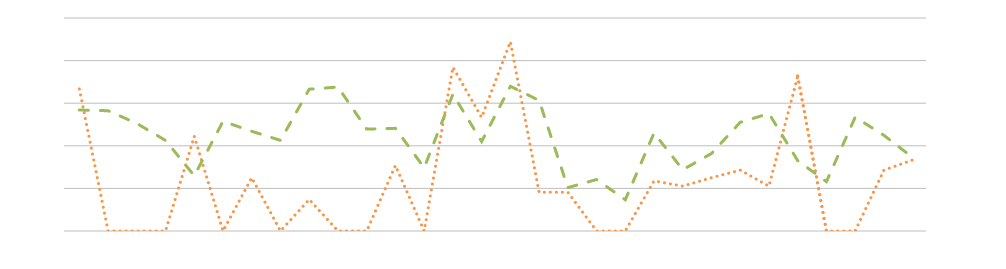
| Category | ctr |
|---|---|
| 2015-09-01 | 0.167 |
| 2015-09-02 | 0 |
| 2015-09-03 | 0 |
| 2015-09-04 | 0 |
| 2015-09-05 | 0.111 |
| 2015-09-06 | 0 |
| 2015-09-07 | 0.062 |
| 2015-09-08 | 0 |
| 2015-09-09 | 0.037 |
| 2015-09-10 | 0 |
| 2015-09-11 | 0 |
| 2015-09-12 | 0.077 |
| 2015-09-13 | 0 |
| 2015-09-14 | 0.192 |
| 2015-09-15 | 0.133 |
| 2015-09-16 | 0.222 |
| 2015-09-17 | 0.045 |
| 2015-09-18 | 0.045 |
| 2015-09-19 | 0 |
| 2015-09-20 | 0 |
| 2015-09-21 | 0.059 |
| 2015-09-22 | 0.053 |
| 2015-09-23 | 0.062 |
| 2015-09-24 | 0.071 |
| 2015-09-25 | 0.053 |
| 2015-09-26 | 0.182 |
| 2015-09-27 | 0 |
| 2015-09-28 | 0 |
| 2015-09-29 | 0.071 |
| 2015-09-30 | 0.083 |